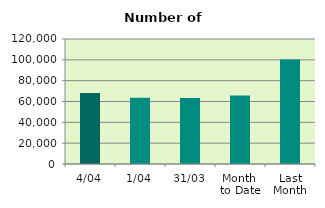
| Category | Series 0 |
|---|---|
| 4/04 | 68158 |
| 1/04 | 63530 |
| 31/03 | 63340 |
| Month 
to Date | 65844 |
| Last
Month | 100276.783 |